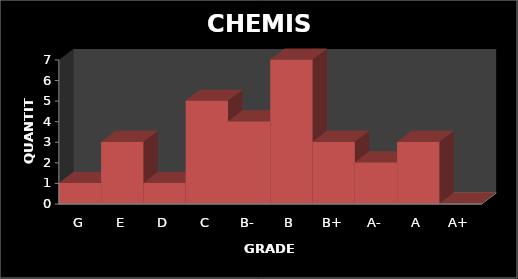
| Category | QUANTITY |
|---|---|
| G | 1 |
| E | 3 |
| D | 1 |
| C | 5 |
| B- | 4 |
| B | 7 |
| B+ | 3 |
| A- | 2 |
| A | 3 |
| A+ | 0 |